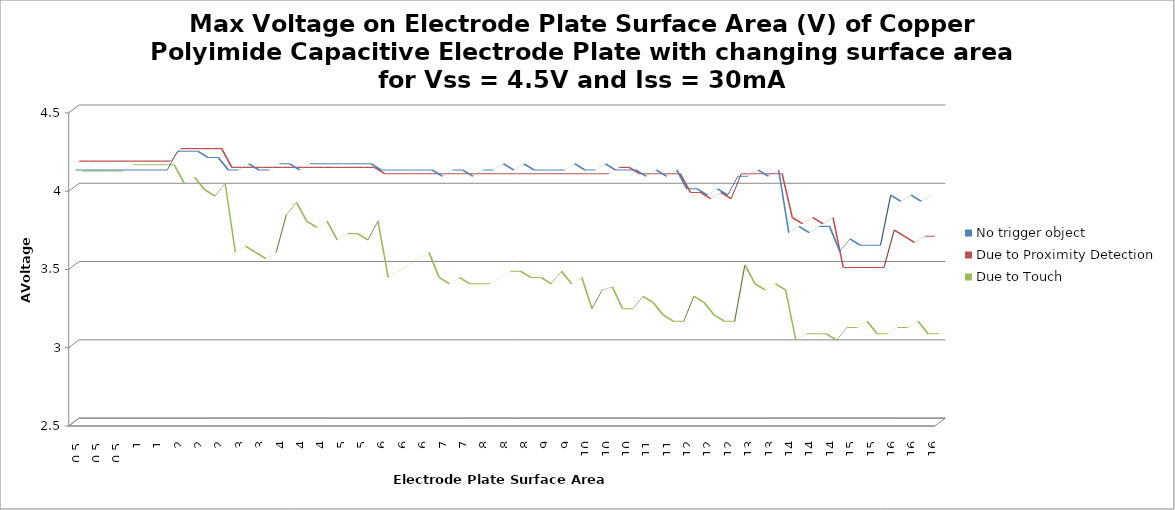
| Category | No trigger object | Due to Proximity Detection | Due to Touch |
|---|---|---|---|
| 0.5 | 4.12 | 4.16 | 4.08 |
| 0.5 | 4.12 | 4.16 | 4.08 |
| 0.5 | 4.12 | 4.16 | 4.08 |
| 0.5 | 4.12 | 4.16 | 4.08 |
| 0.5 | 4.12 | 4.16 | 4.08 |
| 1.0 | 4.12 | 4.16 | 4.12 |
| 1.0 | 4.12 | 4.16 | 4.12 |
| 1.0 | 4.12 | 4.16 | 4.12 |
| 1.0 | 4.12 | 4.16 | 4.12 |
| 1.0 | 4.12 | 4.16 | 4.12 |
| 2.0 | 4.24 | 4.24 | 4 |
| 2.0 | 4.24 | 4.24 | 4.04 |
| 2.0 | 4.24 | 4.24 | 3.96 |
| 2.0 | 4.2 | 4.24 | 3.92 |
| 2.0 | 4.2 | 4.24 | 4 |
| 3.0 | 4.12 | 4.12 | 3.56 |
| 3.0 | 4.12 | 4.12 | 3.6 |
| 3.0 | 4.16 | 4.12 | 3.56 |
| 3.0 | 4.12 | 4.12 | 3.52 |
| 3.0 | 4.12 | 4.12 | 3.56 |
| 4.0 | 4.16 | 4.12 | 3.8 |
| 4.0 | 4.16 | 4.12 | 3.88 |
| 4.0 | 4.12 | 4.12 | 3.76 |
| 4.0 | 4.16 | 4.12 | 3.72 |
| 4.0 | 4.16 | 4.12 | 3.76 |
| 5.0 | 4.16 | 4.12 | 3.64 |
| 5.0 | 4.16 | 4.12 | 3.68 |
| 5.0 | 4.16 | 4.12 | 3.68 |
| 5.0 | 4.16 | 4.12 | 3.64 |
| 5.0 | 4.16 | 4.12 | 3.76 |
| 6.0 | 4.12 | 4.08 | 3.4 |
| 6.0 | 4.12 | 4.08 | 3.44 |
| 6.0 | 4.12 | 4.08 | 3.48 |
| 6.0 | 4.12 | 4.08 | 3.52 |
| 6.0 | 4.12 | 4.08 | 3.56 |
| 7.0 | 4.12 | 4.08 | 3.4 |
| 7.0 | 4.08 | 4.08 | 3.36 |
| 7.0 | 4.12 | 4.08 | 3.4 |
| 7.0 | 4.12 | 4.08 | 3.36 |
| 7.0 | 4.08 | 4.08 | 3.36 |
| 8.0 | 4.12 | 4.08 | 3.36 |
| 8.0 | 4.12 | 4.08 | 3.4 |
| 8.0 | 4.16 | 4.08 | 3.44 |
| 8.0 | 4.12 | 4.08 | 3.44 |
| 8.0 | 4.16 | 4.08 | 3.4 |
| 9.0 | 4.12 | 4.08 | 3.4 |
| 9.0 | 4.12 | 4.08 | 3.36 |
| 9.0 | 4.12 | 4.08 | 3.44 |
| 9.0 | 4.12 | 4.08 | 3.36 |
| 9.0 | 4.16 | 4.08 | 3.4 |
| 10.0 | 4.12 | 4.08 | 3.2 |
| 10.0 | 4.12 | 4.08 | 3.32 |
| 10.0 | 4.16 | 4.08 | 3.34 |
| 10.0 | 4.12 | 4.12 | 3.2 |
| 10.0 | 4.12 | 4.12 | 3.2 |
| 11.0 | 4.12 | 4.08 | 3.28 |
| 11.0 | 4.08 | 4.08 | 3.24 |
| 11.0 | 4.12 | 4.08 | 3.16 |
| 11.0 | 4.08 | 4.08 | 3.12 |
| 11.0 | 4.12 | 4.08 | 3.12 |
| 12.0 | 4 | 3.96 | 3.28 |
| 12.0 | 4 | 3.96 | 3.24 |
| 12.0 | 3.96 | 3.92 | 3.16 |
| 12.0 | 4 | 3.96 | 3.12 |
| 12.0 | 3.96 | 3.92 | 3.12 |
| 13.0 | 4.08 | 4.08 | 3.48 |
| 13.0 | 4.08 | 4.08 | 3.36 |
| 13.0 | 4.12 | 4.08 | 3.32 |
| 13.0 | 4.08 | 4.08 | 3.36 |
| 13.0 | 4.12 | 4.08 | 3.32 |
| 14.0 | 3.72 | 3.8 | 3 |
| 14.0 | 3.76 | 3.76 | 3.04 |
| 14.0 | 3.72 | 3.8 | 3.04 |
| 14.0 | 3.76 | 3.76 | 3.04 |
| 14.0 | 3.76 | 3.8 | 3 |
| 15.0 | 3.6 | 3.48 | 3.08 |
| 15.0 | 3.68 | 3.48 | 3.08 |
| 15.0 | 3.64 | 3.48 | 3.12 |
| 15.0 | 3.64 | 3.48 | 3.04 |
| 15.0 | 3.64 | 3.48 | 3.04 |
| 16.0 | 3.96 | 3.72 | 3.08 |
| 16.0 | 3.92 | 3.68 | 3.08 |
| 16.0 | 3.96 | 3.64 | 3.12 |
| 16.0 | 3.92 | 3.68 | 3.04 |
| 16.0 | 3.96 | 3.68 | 3.04 |